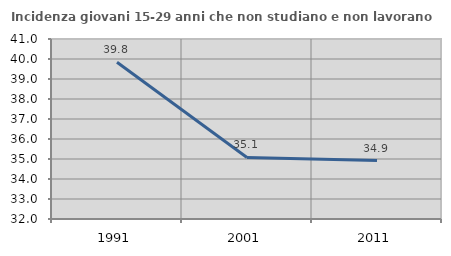
| Category | Incidenza giovani 15-29 anni che non studiano e non lavorano  |
|---|---|
| 1991.0 | 39.837 |
| 2001.0 | 35.079 |
| 2011.0 | 34.921 |